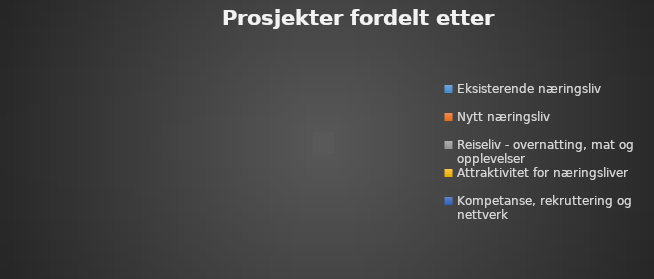
| Category | Series 0 |
|---|---|
| Eksisterende næringsliv | 0 |
| Nytt næringsliv | 0 |
| Reiseliv - overnatting, mat og opplevelser | 0 |
| Attraktivitet for næringsliver | 0 |
| Kompetanse, rekruttering og nettverk | 0 |